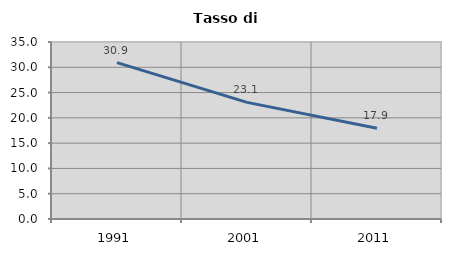
| Category | Tasso di disoccupazione   |
|---|---|
| 1991.0 | 30.931 |
| 2001.0 | 23.063 |
| 2011.0 | 17.948 |